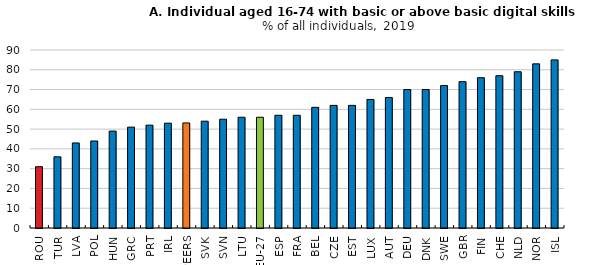
| Category | Series1 |
|---|---|
| ROU | 31 |
| TUR | 36 |
| LVA | 43 |
| POL | 44 |
| HUN | 49 |
| GRC | 51 |
| PRT | 52 |
| IRL | 53 |
| PEERS | 53.125 |
| SVK | 54 |
| SVN | 55 |
| LTU | 56 |
| EU-27 | 56 |
| ESP | 57 |
| FRA | 57 |
| BEL | 61 |
| CZE | 62 |
| EST | 62 |
| LUX | 65 |
| AUT | 66 |
| DEU | 70 |
| DNK | 70 |
| SWE | 72 |
| GBR | 74 |
| FIN | 76 |
| CHE | 77 |
| NLD | 79 |
| NOR | 83 |
| ISL | 85 |